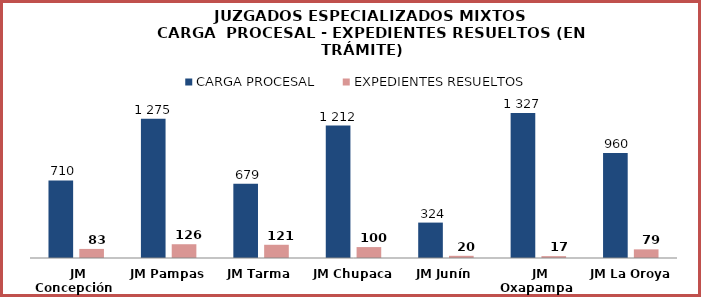
| Category | CARGA PROCESAL | EXPEDIENTES RESUELTOS |
|---|---|---|
| JM Concepción | 710 | 83 |
| JM Pampas | 1275 | 126 |
| JM Tarma | 679 | 121 |
| JM Chupaca | 1212 | 100 |
| JM Junín | 324 | 20 |
| JM Oxapampa | 1327 | 17 |
| JM La Oroya | 960 | 79 |